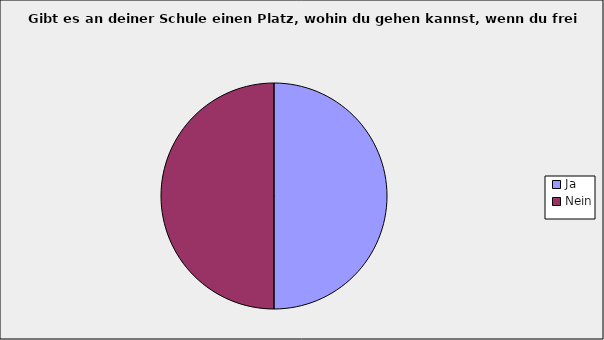
| Category | Series 0 |
|---|---|
| Ja | 0.5 |
| Nein | 0.5 |